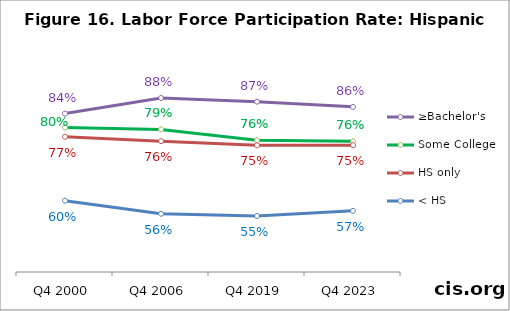
| Category | ≥Bachelor's | Some College | HS only | < HS |
|---|---|---|---|---|
| Q4 2000 | 0.838 | 0.799 | 0.774 | 0.597 |
| Q4 2006 | 0.881 | 0.794 | 0.762 | 0.561 |
| Q4 2019 | 0.871 | 0.764 | 0.75 | 0.555 |
| Q4 2023 | 0.857 | 0.761 | 0.751 | 0.569 |